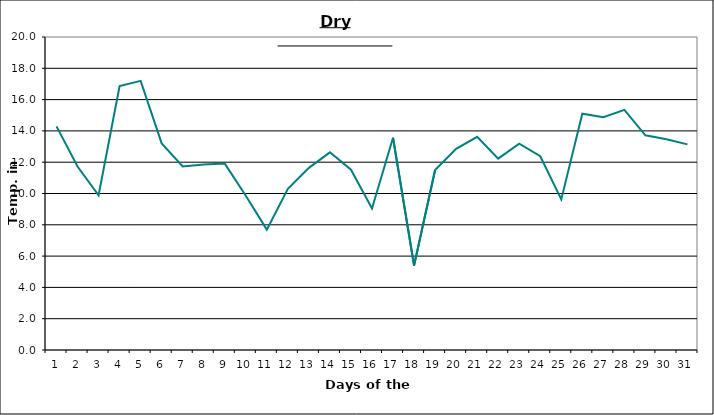
| Category | Series 0 |
|---|---|
| 0 | 14.29 |
| 1 | 11.72 |
| 2 | 9.89 |
| 3 | 16.87 |
| 4 | 17.2 |
| 5 | 13.2 |
| 6 | 11.73 |
| 7 | 11.85 |
| 8 | 11.91 |
| 9 | 9.86 |
| 10 | 7.69 |
| 11 | 10.3 |
| 12 | 11.64 |
| 13 | 12.63 |
| 14 | 11.52 |
| 15 | 9.04 |
| 16 | 13.56 |
| 17 | 5.4 |
| 18 | 11.5 |
| 19 | 12.85 |
| 20 | 13.62 |
| 21 | 12.23 |
| 22 | 13.18 |
| 23 | 12.38 |
| 24 | 9.62 |
| 25 | 15.1 |
| 26 | 14.87 |
| 27 | 15.34 |
| 28 | 13.72 |
| 29 | 13.47 |
| 30 | 13.14 |